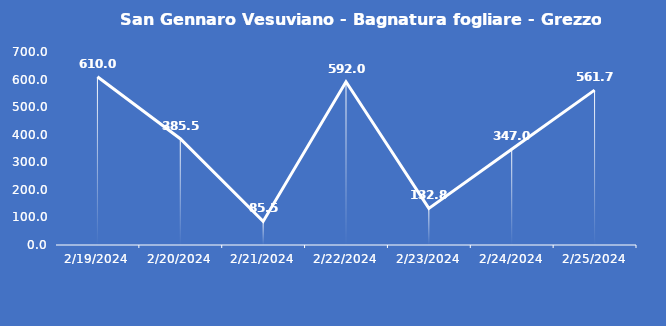
| Category | San Gennaro Vesuviano - Bagnatura fogliare - Grezzo (min) |
|---|---|
| 2/19/24 | 610 |
| 2/20/24 | 385.5 |
| 2/21/24 | 85.5 |
| 2/22/24 | 592 |
| 2/23/24 | 132.8 |
| 2/24/24 | 347 |
| 2/25/24 | 561.7 |